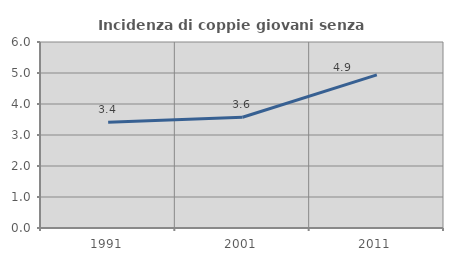
| Category | Incidenza di coppie giovani senza figli |
|---|---|
| 1991.0 | 3.409 |
| 2001.0 | 3.571 |
| 2011.0 | 4.938 |